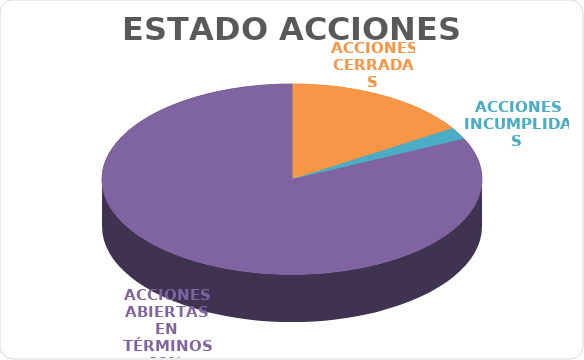
| Category | Series 0 |
|---|---|
| ACCIONES CERRADAS | 8 |
| ACCIONES INCUMPLIDAS | 1 |
| ACCIONES ABIERTAS EN TÉRMINOS | 41 |